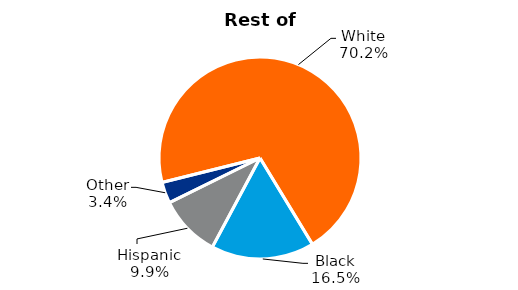
| Category | Series 0 | Rest of State |
|---|---|---|
| White | 70.2 |  |
| Black | 16.5 |  |
| Hispanic | 9.9 |  |
| Other | 3.4 |  |